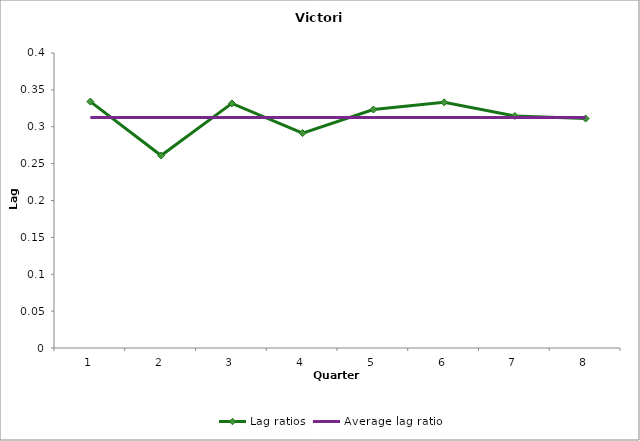
| Category | Lag ratios | Average lag ratio |
|---|---|---|
| 0 | 0.334 | 0.313 |
| 1 | 0.261 | 0.313 |
| 2 | 0.332 | 0.313 |
| 3 | 0.291 | 0.313 |
| 4 | 0.323 | 0.313 |
| 5 | 0.333 | 0.313 |
| 6 | 0.315 | 0.313 |
| 7 | 0.311 | 0.313 |